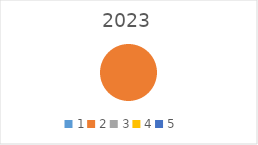
| Category | Series 0 |
|---|---|
| 1.0 | 0 |
| 2.0 | 372250 |
| 3.0 | 0 |
| 4.0 | 0 |
| 5.0 | 0 |